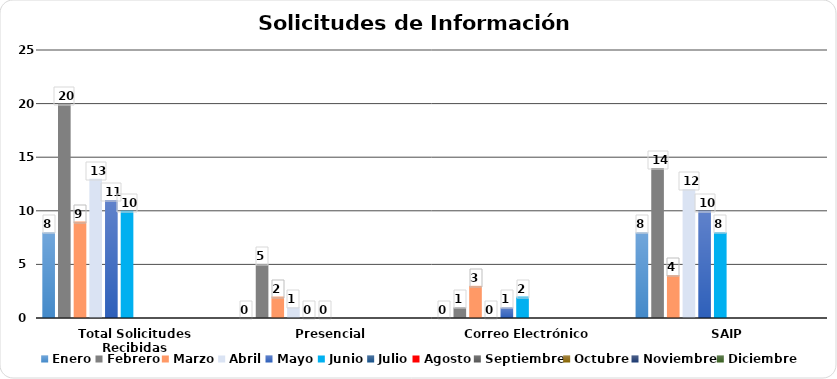
| Category | Enero | Febrero | Marzo | Abril | Mayo | Junio | Julio | Agosto | Septiembre | Octubre | Noviembre | Diciembre |
|---|---|---|---|---|---|---|---|---|---|---|---|---|
| Total Solicitudes Recibidas | 8 | 20 | 9 | 13 | 11 | 10 |  |  |  |  |  |  |
| Presencial | 0 | 5 | 2 | 1 | 0 | 0 |  |  |  |  |  |  |
| Correo Electrónico  | 0 | 1 | 3 | 0 | 1 | 2 |  |  |  |  |  |  |
| SAIP | 8 | 14 | 4 | 12 | 10 | 8 |  |  |  |  |  |  |